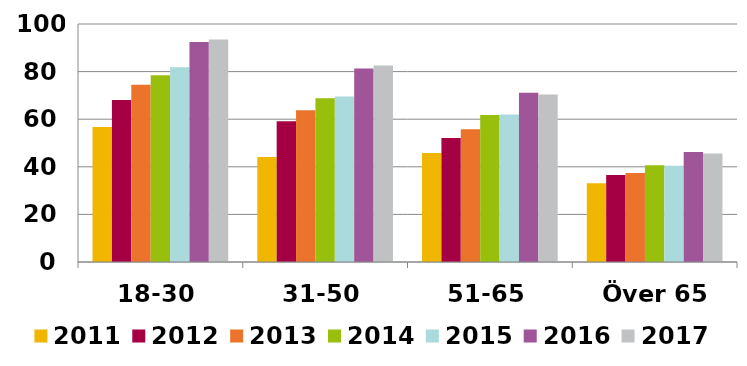
| Category | 2011 | 2012 | 2013 | 2014 | 2015 | 2016 | 2017 |
|---|---|---|---|---|---|---|---|
| 18-30 | 56.702 | 68.016 | 74.469 | 78.424 | 81.782 | 92.484 | 93.448 |
| 31-50 | 44.148 | 59.134 | 63.76 | 68.855 | 69.516 | 81.301 | 82.579 |
| 51-65 | 45.815 | 52.09 | 55.778 | 61.775 | 61.94 | 71.144 | 70.367 |
| Över 65 | 33.104 | 36.503 | 37.367 | 40.63 | 40.464 | 46.246 | 45.608 |